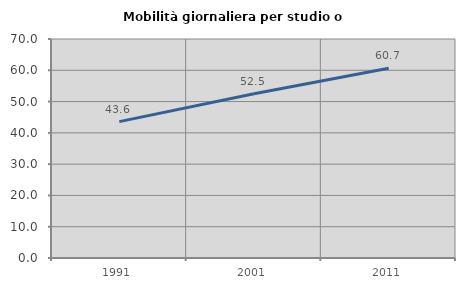
| Category | Mobilità giornaliera per studio o lavoro |
|---|---|
| 1991.0 | 43.582 |
| 2001.0 | 52.52 |
| 2011.0 | 60.676 |